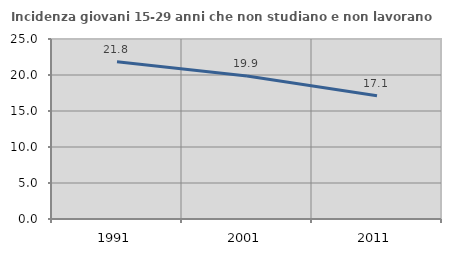
| Category | Incidenza giovani 15-29 anni che non studiano e non lavorano  |
|---|---|
| 1991.0 | 21.839 |
| 2001.0 | 19.858 |
| 2011.0 | 17.117 |